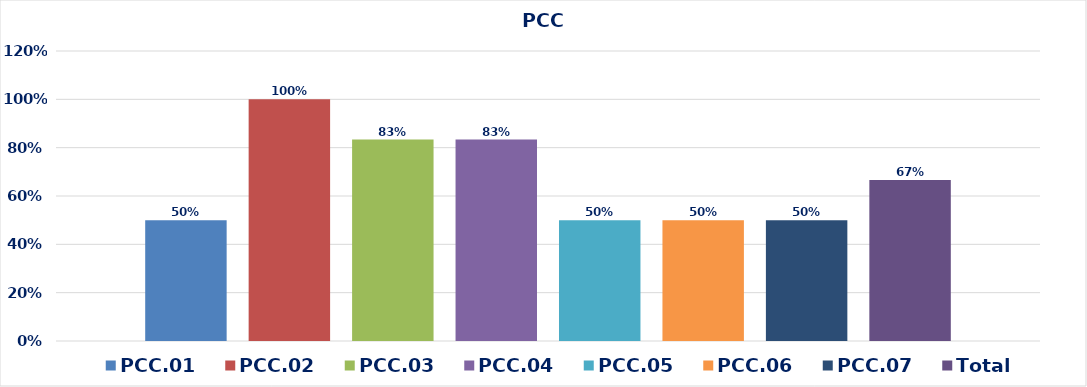
| Category | PCC.01 | PCC.02 | PCC.03 | PCC.04 | PCC.05 | PCC.06 | PCC.07 | Total |
|---|---|---|---|---|---|---|---|---|
| 0 | 0.5 | 1 | 0.833 | 0.833 | 0.5 | 0.5 | 0.5 | 0.667 |